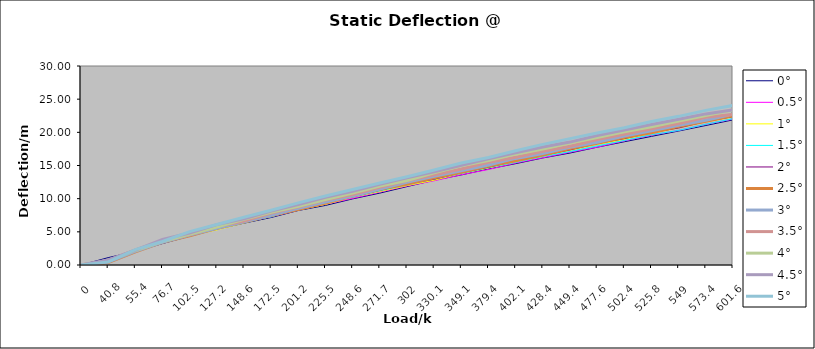
| Category | 0° | 0.5° | 1° | 1.5° | 2° | 2.5° | 3° | 3.5° | 4° | 4.5° | 5° |
|---|---|---|---|---|---|---|---|---|---|---|---|
| 0.0 | 0 | 0 | 0.04 | 0 | 0 | 0.02 | 0.01 | 0 | 0.01 | 0.01 | 0 |
| 40.8 | 1.11 | 0.47 | 0.71 | 0.59 | 0.36 | 0.39 | 0.45 | 0.69 | 0.58 | 0.76 | 0.47 |
| 55.4 | 2.05 | 1.97 | 2.22 | 2.15 | 2.09 | 2 | 2.07 | 2.26 | 2.19 | 2.25 | 2.32 |
| 76.7 | 3.23 | 3.32 | 3.31 | 3.33 | 3.3 | 3.43 | 3.43 | 3.64 | 3.54 | 3.84 | 3.55 |
| 102.5 | 4.36 | 4.58 | 4.43 | 4.63 | 4.57 | 4.41 | 4.53 | 4.58 | 4.62 | 4.83 | 5.04 |
| 127.2 | 5.39 | 5.46 | 5.29 | 5.46 | 5.41 | 5.53 | 5.53 | 5.79 | 5.71 | 6.09 | 6.1 |
| 148.6 | 6.31 | 6.49 | 6.34 | 6.53 | 6.49 | 6.51 | 6.51 | 6.63 | 6.87 | 6.96 | 7.2 |
| 172.5 | 7.16 | 7.28 | 7.33 | 7.26 | 7.41 | 7.44 | 7.5 | 7.82 | 7.96 | 8.13 | 8.25 |
| 201.2 | 8.22 | 8.29 | 8.28 | 8.48 | 8.41 | 8.41 | 8.55 | 8.77 | 8.87 | 9.13 | 9.36 |
| 225.5 | 8.98 | 9.17 | 9.15 | 9.4 | 9.37 | 9.35 | 9.48 | 9.79 | 9.87 | 10.19 | 10.39 |
| 248.6 | 9.97 | 10.05 | 10.21 | 10.23 | 10.28 | 10.38 | 10.4 | 10.62 | 10.86 | 11.11 | 11.39 |
| 271.7 | 10.84 | 10.99 | 11.07 | 11.18 | 11.27 | 11.4 | 11.45 | 11.73 | 11.91 | 12.17 | 12.36 |
| 302.0 | 11.82 | 11.91 | 11.97 | 12.08 | 12.21 | 12.2 | 12.48 | 12.68 | 12.74 | 13.14 | 13.31 |
| 330.1 | 12.79 | 12.7 | 12.78 | 12.99 | 12.95 | 13.13 | 13.38 | 13.59 | 13.88 | 14.06 | 14.33 |
| 349.1 | 13.58 | 13.61 | 13.81 | 13.8 | 13.91 | 13.96 | 14.2 | 14.48 | 14.94 | 15.02 | 15.38 |
| 379.4 | 14.48 | 14.4 | 14.63 | 14.69 | 14.74 | 14.92 | 15.08 | 15.48 | 15.76 | 16.02 | 16.21 |
| 402.1 | 15.28 | 15.38 | 15.53 | 15.48 | 15.69 | 15.72 | 16.07 | 16.25 | 16.71 | 16.92 | 17.22 |
| 428.4 | 16.14 | 16.17 | 16.36 | 16.35 | 16.52 | 16.57 | 16.81 | 17.15 | 17.47 | 17.79 | 18.18 |
| 449.4 | 16.88 | 17.01 | 17.3 | 17.1 | 17.35 | 17.56 | 17.76 | 17.89 | 18.4 | 18.53 | 19.05 |
| 477.6 | 17.76 | 17.77 | 18.18 | 17.94 | 18.31 | 18.35 | 18.5 | 18.92 | 19.2 | 19.52 | 19.89 |
| 502.4 | 18.58 | 18.71 | 18.94 | 18.77 | 19.05 | 19.24 | 19.45 | 19.7 | 20.08 | 20.34 | 20.7 |
| 525.8 | 19.39 | 19.58 | 19.84 | 19.64 | 19.95 | 19.95 | 20.22 | 20.55 | 20.82 | 21.18 | 21.63 |
| 549.0 | 20.2 | 20.29 | 20.66 | 20.29 | 20.66 | 20.9 | 21.06 | 21.33 | 21.71 | 21.97 | 22.41 |
| 573.4 | 21.03 | 21.21 | 21.56 | 21.22 | 21.62 | 21.67 | 21.83 | 22.28 | 22.54 | 22.78 | 23.31 |
| 601.6 | 21.88 | 22 | 22.31 | 22.05 | 22.37 | 22.52 | 22.72 | 22.71 | 23.38 | 23.38 | 24.05 |